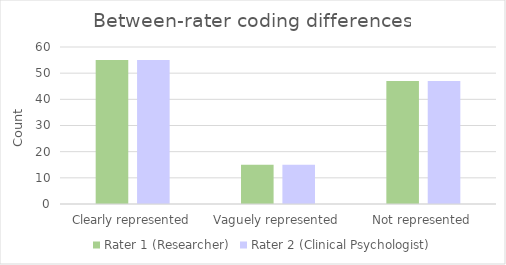
| Category | Rater 1 (Researcher) | Rater 2 (Clinical Psychologist) |
|---|---|---|
| Clearly represented | 55 | 55 |
| Vaguely represented | 15 | 15 |
| Not represented | 47 | 47 |